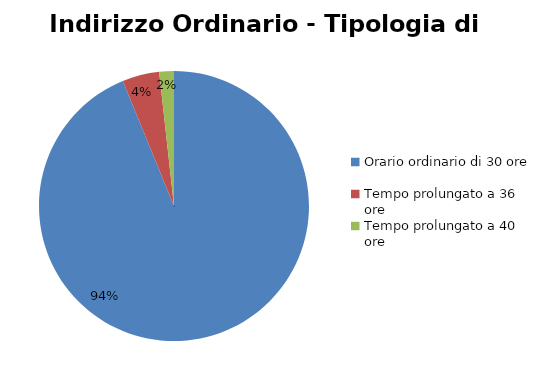
| Category | Series 0 |
|---|---|
| Orario ordinario di 30 ore | 33810 |
| Tempo prolungato a 36 ore | 1599 |
| Tempo prolungato a 40 ore | 632 |